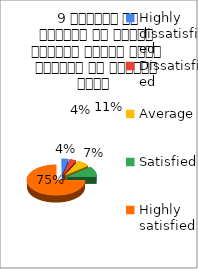
| Category |  9 शिक्षक ने शिक्षण के दौरान आधुनिक तकनीक पावर पॉइन्ट का प्रयोग किया   |
|---|---|
| Highly dissatisfied | 1 |
| Dissatisfied | 1 |
| Average | 2 |
| Satisfied | 3 |
| Highly satisfied | 21 |